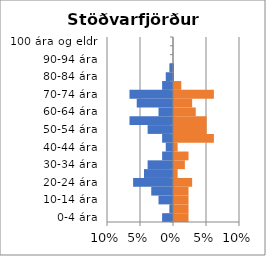
| Category | % karlar | %konur |
|---|---|---|
| 0-4 ára | -0.016 | 0.022 |
| 5-9 ára | -0.005 | 0.022 |
| 10-14 ára | -0.022 | 0.022 |
| 15-19 ára | -0.033 | 0.022 |
| 20-24 ára | -0.06 | 0.027 |
| 25-29 ára | -0.044 | 0.005 |
| 30-34 ára | -0.038 | 0.016 |
| 35-39 ára | -0.016 | 0.022 |
| 40-44 ára | -0.011 | 0.005 |
| 45-49 ára | -0.016 | 0.06 |
| 50-54 ára | -0.038 | 0.049 |
| 55-59 ára | -0.066 | 0.049 |
| 60-64 ára | -0.022 | 0.033 |
| 65-69 ára | -0.055 | 0.027 |
| 70-74 ára | -0.066 | 0.06 |
| 75-79 ára | -0.016 | 0.011 |
| 80-84 ára | -0.011 | 0 |
| 85-89 ára | -0.005 | 0 |
| 90-94 ára | 0 | 0 |
| 95-99 ára | 0 | 0 |
| 100 ára og eldri | 0 | 0 |